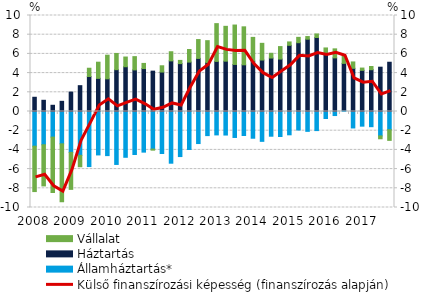
| Category | Államháztartás* | Háztartás | Vállalat |
|---|---|---|---|
| 2008.0 | -3.614 | 1.482 | -4.726 |
| nan | -3.465 | 1.167 | -4.286 |
| nan | -2.667 | 0.647 | -5.769 |
| nan | -3.365 | 1.06 | -6.035 |
| 2009.0 | -4.26 | 2.022 | -3.85 |
| nan | -4.568 | 2.69 | -1.185 |
| nan | -5.737 | 3.646 | 0.861 |
| nan | -4.523 | 3.452 | 1.684 |
| 2010.0 | -4.596 | 3.403 | 2.463 |
| nan | -5.515 | 4.357 | 1.688 |
| nan | -4.769 | 4.662 | 1.012 |
| nan | -4.478 | 4.334 | 1.381 |
| 2011.0 | -4.232 | 4.471 | 0.537 |
| nan | -3.914 | 4.204 | -0.111 |
| nan | -4.378 | 4.109 | 0.654 |
| nan | -5.386 | 5.273 | 0.951 |
| 2012.0 | -4.694 | 4.99 | 0.332 |
| nan | -3.959 | 5.147 | 1.313 |
| nan | -3.339 | 5.529 | 1.965 |
| nan | -2.511 | 5.095 | 2.283 |
| 2013.0 | -2.438 | 5.217 | 3.935 |
| nan | -2.452 | 5.243 | 3.629 |
| nan | -2.704 | 4.902 | 4.105 |
| nan | -2.499 | 4.863 | 3.957 |
| 2014.0 | -2.784 | 5.255 | 2.466 |
| nan | -3.109 | 5.362 | 1.739 |
| nan | -2.575 | 5.569 | 0.494 |
| nan | -2.602 | 5.462 | 1.299 |
| 2015.0 | -2.428 | 6.893 | 0.355 |
| nan | -1.927 | 7.166 | 0.557 |
| nan | -2.068 | 7.531 | 0.277 |
| nan | -1.989 | 7.706 | 0.374 |
| 2016.0 | -0.728 | 5.929 | 0.691 |
| nan | -0.421 | 5.586 | 0.939 |
| nan | 0.128 | 4.885 | 0.799 |
| nan | -1.716 | 4.497 | 0.666 |
| 2017.0 | -1.527 | 4.289 | 0.235 |
| nan | -1.583 | 4.353 | 0.332 |
| nan | -2.543 | 4.616 | -0.298 |
| nan | -1.891 | 5.131 | -1.116 |